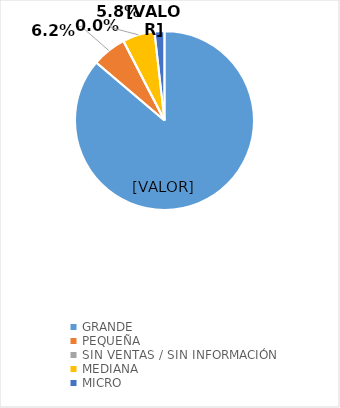
| Category | Series 0 |
|---|---|
| GRANDE | 0.862 |
| PEQUEÑA | 0.062 |
| SIN VENTAS / SIN INFORMACIÓN | 0 |
| MEDIANA | 0.058 |
| MICRO | 0.018 |